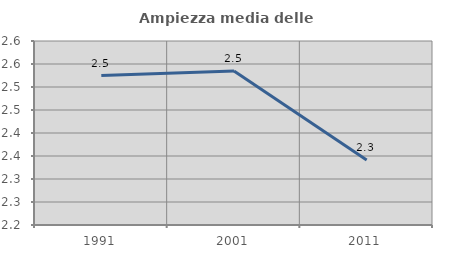
| Category | Ampiezza media delle famiglie |
|---|---|
| 1991.0 | 2.525 |
| 2001.0 | 2.535 |
| 2011.0 | 2.341 |